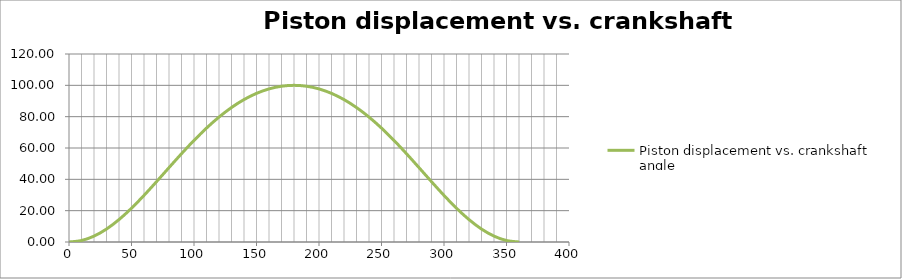
| Category | Piston displacement vs. crankshaft angle |
|---|---|
| 0.0 | 0 |
| 10.0 | 0.948 |
| 20.0 | 3.748 |
| 30.0 | 8.267 |
| 40.0 | 14.297 |
| 50.0 | 21.563 |
| 60.0 | 29.744 |
| 70.0 | 38.496 |
| 80.0 | 47.474 |
| 90.0 | 56.351 |
| 100.0 | 64.839 |
| 110.0 | 72.698 |
| 120.0 | 79.744 |
| 130.0 | 85.841 |
| 140.0 | 90.901 |
| 150.0 | 94.87 |
| 160.0 | 97.717 |
| 170.0 | 99.429 |
| 180.0 | 100 |
| 190.0 | 99.429 |
| 200.0 | 97.717 |
| 210.0 | 94.87 |
| 220.0 | 90.901 |
| 230.0 | 85.841 |
| 240.0 | 79.744 |
| 250.0 | 72.698 |
| 260.0 | 64.839 |
| 270.0 | 56.351 |
| 280.0 | 47.474 |
| 290.0 | 38.496 |
| 300.0 | 29.744 |
| 310.0 | 21.563 |
| 320.0 | 14.297 |
| 330.0 | 8.267 |
| 340.0 | 3.748 |
| 350.0 | 0.948 |
| 360.0 | 0 |